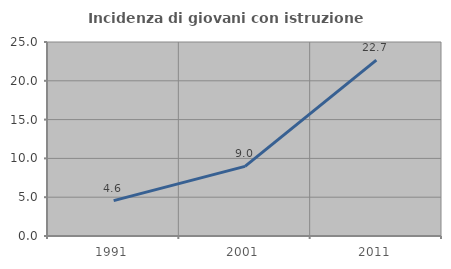
| Category | Incidenza di giovani con istruzione universitaria |
|---|---|
| 1991.0 | 4.558 |
| 2001.0 | 8.974 |
| 2011.0 | 22.664 |